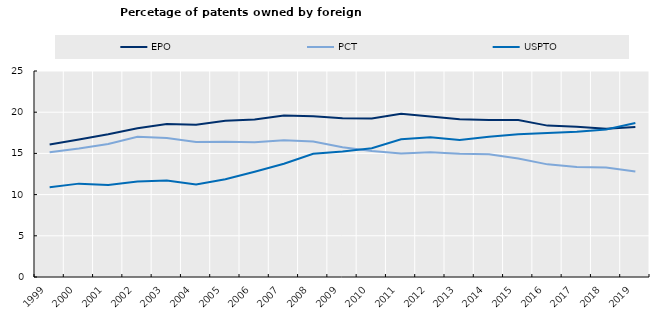
| Category | EPO | PCT | USPTO |
|---|---|---|---|
| 1999.0 | 16.07 | 15.144 | 10.887 |
| 2000.0 | 16.696 | 15.599 | 11.331 |
| 2001.0 | 17.316 | 16.142 | 11.174 |
| 2002.0 | 18.051 | 17.023 | 11.588 |
| 2003.0 | 18.556 | 16.872 | 11.709 |
| 2004.0 | 18.481 | 16.377 | 11.236 |
| 2005.0 | 18.955 | 16.409 | 11.868 |
| 2006.0 | 19.127 | 16.361 | 12.771 |
| 2007.0 | 19.589 | 16.584 | 13.744 |
| 2008.0 | 19.5 | 16.434 | 14.949 |
| 2009.0 | 19.257 | 15.74 | 15.24 |
| 2010.0 | 19.239 | 15.295 | 15.623 |
| 2011.0 | 19.821 | 14.982 | 16.711 |
| 2012.0 | 19.466 | 15.14 | 16.946 |
| 2013.0 | 19.135 | 14.954 | 16.628 |
| 2014.0 | 19.051 | 14.894 | 17.029 |
| 2015.0 | 19.05 | 14.393 | 17.319 |
| 2016.0 | 18.372 | 13.669 | 17.478 |
| 2017.0 | 18.232 | 13.342 | 17.641 |
| 2018.0 | 17.983 | 13.29 | 17.899 |
| 2019.0 | 18.21 | 12.798 | 18.694 |